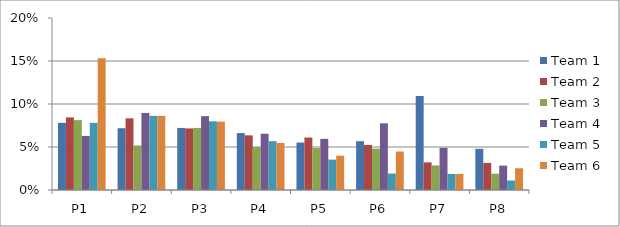
| Category | Team 1 | Team 2 | Team 3 | Team 4 | Team 5 | Team 6 |
|---|---|---|---|---|---|---|
| P1 | 0.078 | 0.084 | 0.081 | 0.063 | 0.078 | 0.153 |
| P2 | 0.072 | 0.083 | 0.052 | 0.09 | 0.086 | 0.086 |
| P3 | 0.072 | 0.072 | 0.072 | 0.086 | 0.08 | 0.079 |
| P4 | 0.066 | 0.064 | 0.05 | 0.065 | 0.057 | 0.055 |
| P5 | 0.055 | 0.061 | 0.049 | 0.059 | 0.035 | 0.04 |
| P6 | 0.057 | 0.052 | 0.048 | 0.078 | 0.019 | 0.045 |
| P7 | 0.109 | 0.032 | 0.029 | 0.049 | 0.019 | 0.019 |
| P8 | 0.048 | 0.031 | 0.019 | 0.028 | 0.011 | 0.025 |